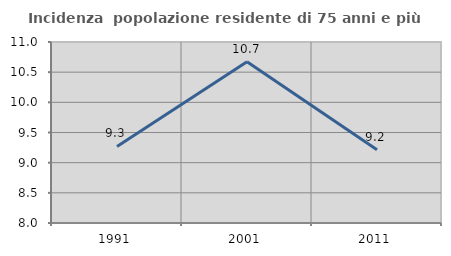
| Category | Incidenza  popolazione residente di 75 anni e più |
|---|---|
| 1991.0 | 9.27 |
| 2001.0 | 10.674 |
| 2011.0 | 9.213 |